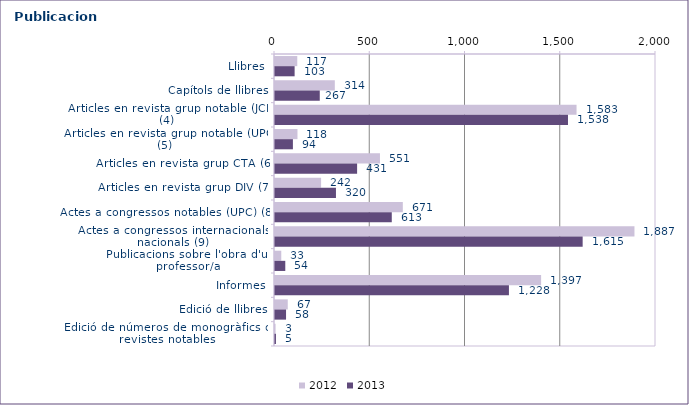
| Category | 2012 | 2013 |
|---|---|---|
| Llibres | 117 | 103 |
| Capítols de llibres | 314 | 235 |
| Articles en revista grup notable (JCR) (4) | 1583 | 1538 |
| Articles en revista grup notable (UPC) (5) | 118 | 94 |
| Articles en revista grup CTA (6) | 551 | 431 |
| Articles en revista grup DIV (7) | 242 | 320 |
| Actes a congressos notables (UPC) (8) | 671 | 613 |
| Actes a congressos internacionals i nacionals (9) | 1887 | 1615 |
| Publicacions sobre l'obra d'un professor/a | 33 | 54 |
| Informes | 1397 | 1228 |
| Edició de llibres | 67 | 58 |
| Edició de números de monogràfics de revistes notables | 3 | 5 |